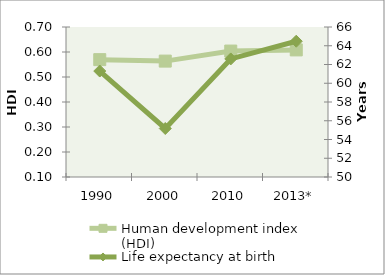
| Category | Human development index (HDI) |
|---|---|
| 1990 | 0.569 |
| 2000 | 0.564 |
| 2010 | 0.604 |
| 2013* | 0.608 |